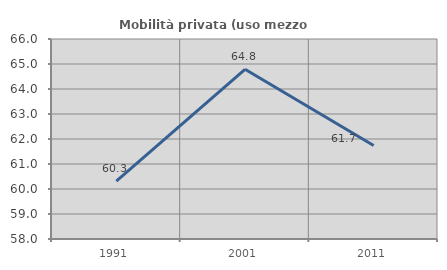
| Category | Mobilità privata (uso mezzo privato) |
|---|---|
| 1991.0 | 60.314 |
| 2001.0 | 64.787 |
| 2011.0 | 61.739 |